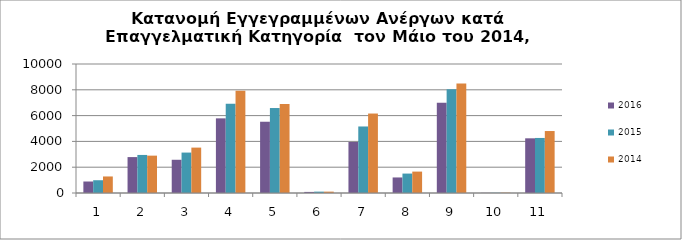
| Category | 2016 | 2015 | 2014 |
|---|---|---|---|
| 1.0 | 891 | 990 | 1282 |
| 2.0 | 2784 | 2950 | 2896 |
| 3.0 | 2576 | 3134 | 3519 |
| 4.0 | 5786 | 6921 | 7927 |
| 5.0 | 5524 | 6587 | 6906 |
| 6.0 | 84 | 106 | 106 |
| 7.0 | 3953 | 5157 | 6160 |
| 8.0 | 1205 | 1506 | 1659 |
| 9.0 | 6993 | 8037 | 8486 |
| 10.0 | 12 | 17 | 23 |
| 11.0 | 4239 | 4267 | 4804 |